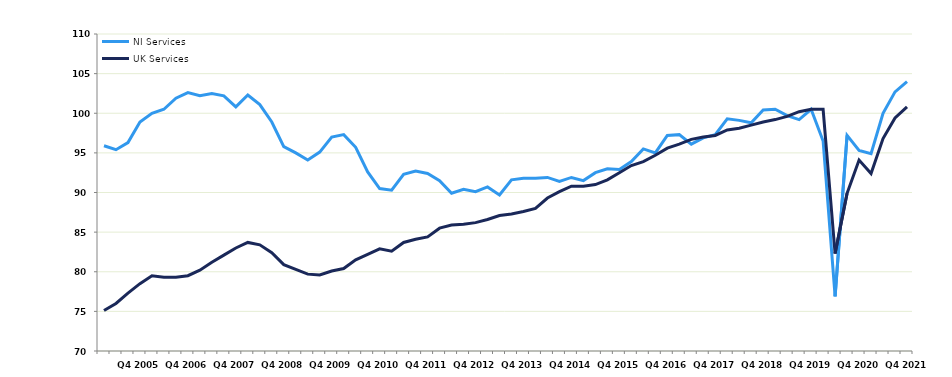
| Category | NI Services | UK Services |
|---|---|---|
|  | 95.9 | 75.1 |
|  | 95.4 | 76 |
|  | 96.3 | 77.3 |
| Q4 2005 | 98.9 | 78.5 |
|  | 100 | 79.5 |
|  | 100.5 | 79.3 |
|  | 101.9 | 79.3 |
| Q4 2006 | 102.6 | 79.5 |
|  | 102.2 | 80.2 |
|  | 102.5 | 81.2 |
|  | 102.2 | 82.1 |
| Q4 2007 | 100.8 | 83 |
|  | 102.3 | 83.7 |
|  | 101.1 | 83.4 |
|  | 98.9 | 82.4 |
| Q4 2008 | 95.8 | 80.9 |
|  | 95 | 80.3 |
|  | 94.1 | 79.7 |
|  | 95.1 | 79.6 |
| Q4 2009 | 97 | 80.1 |
|  | 97.3 | 80.4 |
|  | 95.7 | 81.5 |
|  | 92.6 | 82.2 |
| Q4 2010 | 90.5 | 82.9 |
|  | 90.3 | 82.6 |
|  | 92.3 | 83.7 |
|  | 92.7 | 84.1 |
| Q4 2011 | 92.4 | 84.4 |
|  | 91.5 | 85.5 |
|  | 89.9 | 85.9 |
|  | 90.4 | 86 |
| Q4 2012 | 90.1 | 86.2 |
|  | 90.7 | 86.6 |
|  | 89.7 | 87.1 |
|  | 91.6 | 87.3 |
| Q4 2013 | 91.8 | 87.6 |
|  | 91.8 | 88 |
|  | 91.9 | 89.3 |
|  | 91.4 | 90.1 |
| Q4 2014 | 91.9 | 90.8 |
|  | 91.5 | 90.8 |
|  | 92.5 | 91 |
|  | 93 | 91.6 |
| Q4 2015 | 92.9 | 92.5 |
|  | 93.9 | 93.4 |
|  | 95.5 | 93.9 |
|  | 95 | 94.7 |
| Q4 2016 | 97.2 | 95.6 |
|  | 97.3 | 96.1 |
|  | 96.1 | 96.7 |
|  | 96.9 | 97 |
| Q4 2017 | 97.3 | 97.2 |
|  | 99.3 | 97.9 |
|  | 99.1 | 98.1 |
|  | 98.8 | 98.5 |
| Q4 2018 | 100.4 | 98.9 |
|  | 100.5 | 99.2 |
|  | 99.7 | 99.6 |
|  | 99.2 | 100.2 |
| Q4 2019 | 100.5 | 100.5 |
|  | 96.5 | 100.5 |
|  | 76.9 | 82.3 |
|  | 97.2 | 89.9 |
| Q4 2020 | 95.3 | 94.1 |
|  | 94.9 | 92.4 |
|  | 100 | 96.8 |
|  | 102.7 | 99.4 |
| Q4 2021 | 104 | 100.8 |